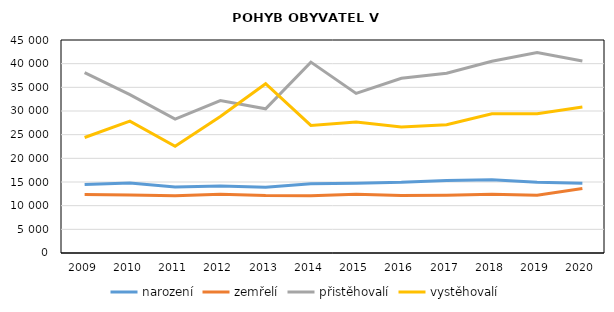
| Category | narození | zemřelí | přistěhovalí | vystěhovalí |
|---|---|---|---|---|
| 2009.0 | 14488 | 12365 | 38094 | 24402 |
| 2010.0 | 14792 | 12266 | 33461 | 27855 |
| 2011.0 | 13968 | 12092 | 28291 | 22540 |
| 2012.0 | 14176 | 12411 | 32194 | 28843 |
| 2013.0 | 13867 | 12149 | 30473 | 35770 |
| 2014.0 | 14624 | 12118 | 40332 | 26960 |
| 2015.0 | 14759 | 12420 | 33711 | 27680 |
| 2016.0 | 14929 | 12141 | 36901 | 26630 |
| 2017.0 | 15324 | 12199 | 37976 | 27096 |
| 2018.0 | 15460 | 12417 | 40503 | 29427 |
| 2019.0 | 14933 | 12178 | 42328 | 29438 |
| 2020.0 | 14713 | 13621 | 40582 | 30867 |